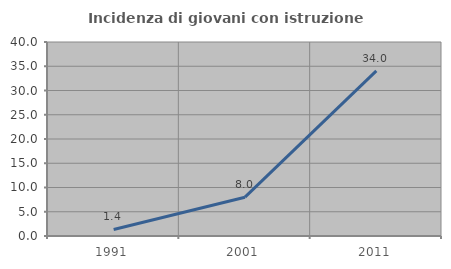
| Category | Incidenza di giovani con istruzione universitaria |
|---|---|
| 1991.0 | 1.351 |
| 2001.0 | 8 |
| 2011.0 | 34.043 |